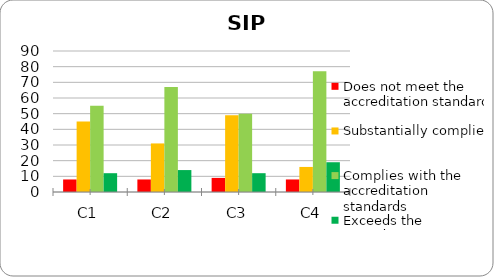
| Category | Does not meet the accreditation standard | Substantially complies | Complies with the accreditation standards | Exceeds the accreditation standards |
|---|---|---|---|---|
| C1 | 8 | 45 | 55 | 12 |
| C2 | 8 | 31 | 67 | 14 |
| C3 | 9 | 49 | 50 | 12 |
| C4 | 8 | 16 | 77 | 19 |